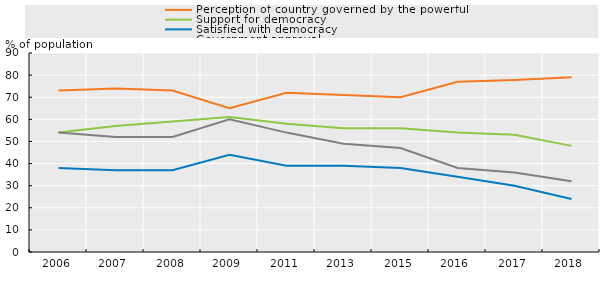
| Category | Perception of country governed by the powerful | Support for democracy | Satisfied with democracy | Government approval |
|---|---|---|---|---|
| 2006.0 | 73 | 54 | 38 | 54 |
| 2007.0 | 74 | 57 | 37 | 52 |
| 2008.0 | 73 | 59 | 37 | 52 |
| 2009.0 | 65 | 61 | 44 | 60 |
| 2011.0 | 72 | 58 | 39 | 54 |
| 2013.0 | 71 | 56 | 39 | 49 |
| 2015.0 | 70 | 56 | 38 | 47 |
| 2016.0 | 77 | 54 | 34 | 38 |
| 2017.0 | 77.773 | 53 | 30 | 36 |
| 2018.0 | 79 | 48 | 24 | 32 |